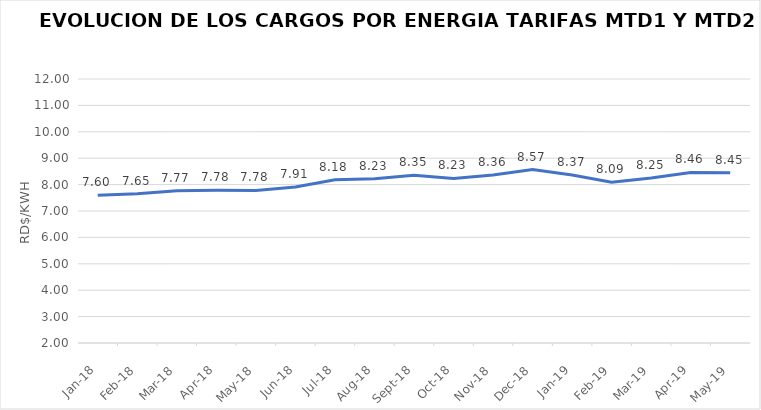
| Category | Series 0 |
|---|---|
| 2018-01-01 | 7.597 |
| 2018-02-01 | 7.65 |
| 2018-03-01 | 7.766 |
| 2018-04-01 | 7.782 |
| 2018-05-01 | 7.78 |
| 2018-06-01 | 7.912 |
| 2018-07-01 | 8.181 |
| 2018-08-01 | 8.226 |
| 2018-09-01 | 8.355 |
| 2018-10-01 | 8.234 |
| 2018-11-01 | 8.36 |
| 2018-12-01 | 8.57 |
| 2019-01-01 | 8.367 |
| 2019-02-01 | 8.093 |
| 2019-03-01 | 8.251 |
| 2019-04-01 | 8.46 |
| 2019-05-01 | 8.45 |